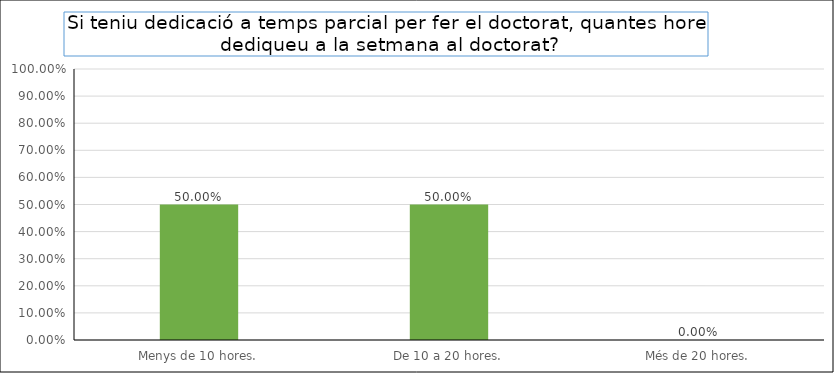
| Category | Series 0 |
|---|---|
| Menys de 10 hores. | 0.5 |
| De 10 a 20 hores. | 0.5 |
| Més de 20 hores. | 0 |